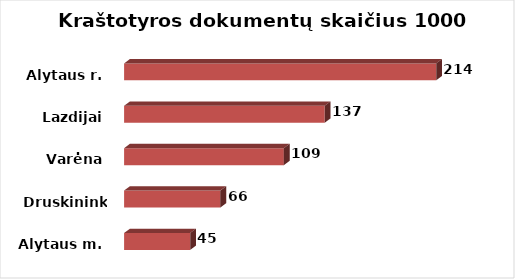
| Category | Series 0 |
|---|---|
| Alytaus m. | 45.227 |
| Druskininkai | 65.899 |
| Varėna | 109.397 |
| Lazdijai | 137.364 |
| Alytaus r. | 213.674 |